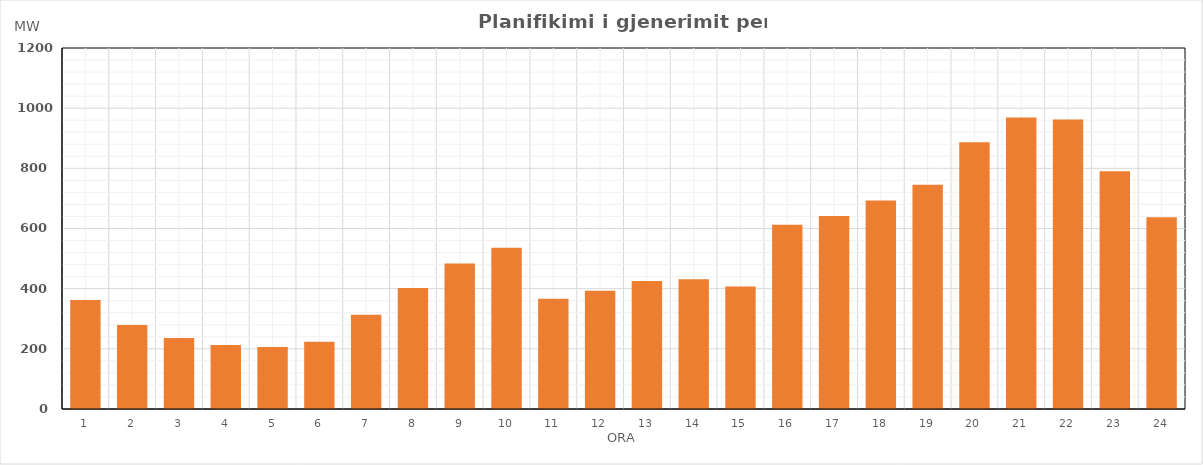
| Category | Max (MW) |
|---|---|
| 0 | 362.56 |
| 1 | 279.23 |
| 2 | 235.9 |
| 3 | 212.91 |
| 4 | 205.99 |
| 5 | 223.17 |
| 6 | 312.99 |
| 7 | 402.62 |
| 8 | 483.72 |
| 9 | 536.32 |
| 10 | 366.76 |
| 11 | 392.75 |
| 12 | 425.34 |
| 13 | 431.22 |
| 14 | 407.24 |
| 15 | 612.19 |
| 16 | 641.8 |
| 17 | 692.74 |
| 18 | 745.34 |
| 19 | 886.42 |
| 20 | 968.65 |
| 21 | 962.05 |
| 22 | 790.55 |
| 23 | 637.45 |